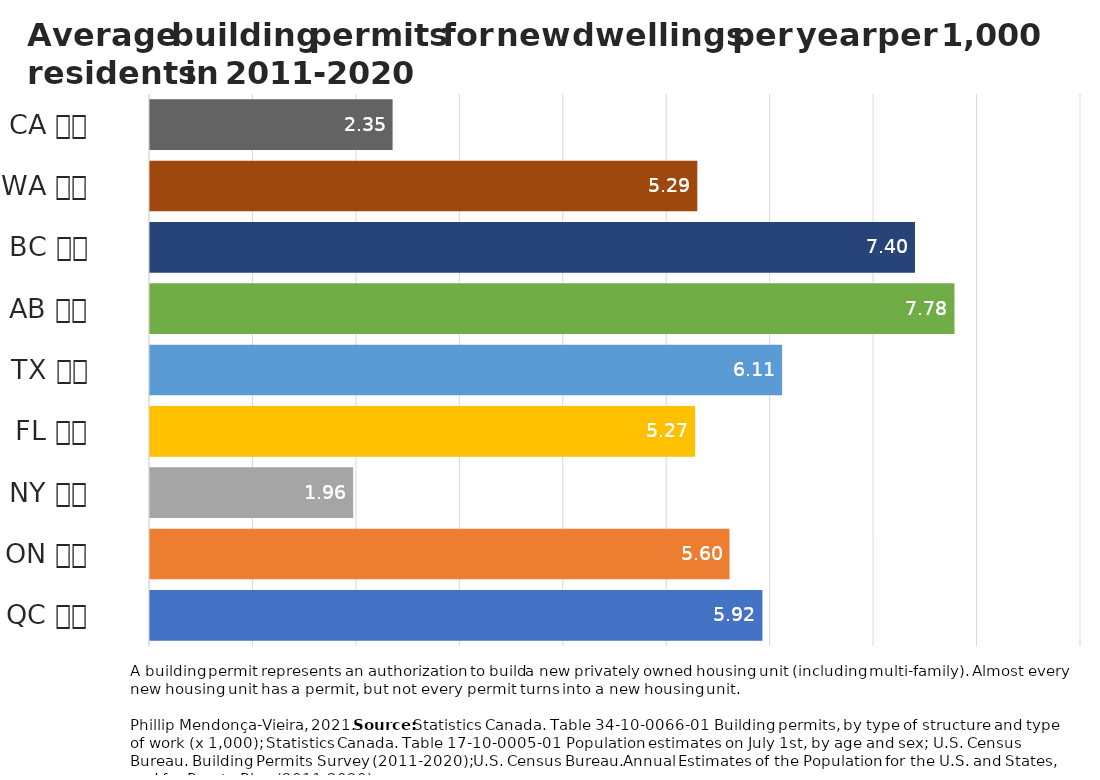
| Category | Average building permits per 1,000 residents 2011-2020 |
|---|---|
| QC 🇨🇦 | 5.92 |
| ON 🇨🇦 | 5.602 |
| NY 🇺🇸 | 1.964 |
| FL 🇺🇸 | 5.27 |
| TX 🇺🇸 | 6.111 |
| AB 🇨🇦 | 7.777 |
| BC 🇨🇦 | 7.395 |
| WA 🇺🇸 | 5.291 |
| CA 🇺🇸 | 2.345 |